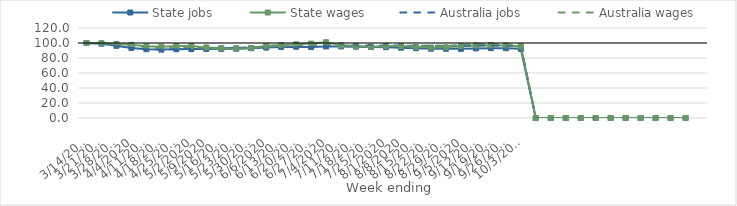
| Category | State jobs | State wages | Australia jobs | Australia wages |
|---|---|---|---|---|
| 14/03/2020 | 100 | 100 | 100 | 100 |
| 21/03/2020 | 99.066 | 99.679 | 99.271 | 99.673 |
| 28/03/2020 | 96.252 | 98.625 | 96.296 | 98.402 |
| 04/04/2020 | 93.293 | 97.505 | 93.638 | 96.698 |
| 11/04/2020 | 91.7 | 95.592 | 91.923 | 94.162 |
| 18/04/2020 | 91.206 | 95.086 | 91.471 | 94.06 |
| 25/04/2020 | 91.722 | 95.834 | 91.807 | 94.247 |
| 02/05/2020 | 91.848 | 96.045 | 92.206 | 94.699 |
| 09/05/2020 | 92.037 | 94.093 | 92.756 | 93.319 |
| 16/05/2020 | 92.231 | 93.337 | 93.289 | 92.663 |
| 23/05/2020 | 92.383 | 93.027 | 93.593 | 92.285 |
| 30/05/2020 | 93.03 | 93.352 | 94.094 | 93.58 |
| 06/06/2020 | 93.901 | 96.184 | 95.016 | 95.453 |
| 13/06/2020 | 94.772 | 97.191 | 95.471 | 96.086 |
| 20/06/2020 | 95.045 | 98.238 | 95.658 | 97.003 |
| 27/06/2020 | 94.642 | 99.197 | 95.603 | 97.208 |
| 04/07/2020 | 95.411 | 101.079 | 96.357 | 98.944 |
| 11/07/2020 | 95.451 | 96.839 | 96.686 | 95.884 |
| 18/07/2020 | 95.109 | 96.157 | 96.562 | 95.403 |
| 25/07/2020 | 94.642 | 95.045 | 96.622 | 95.053 |
| 01/08/2020 | 94.48 | 96.153 | 96.719 | 95.78 |
| 08/08/2020 | 93.744 | 95.928 | 96.574 | 96.121 |
| 15/08/2020 | 93.056 | 94.914 | 96.402 | 95.627 |
| 22/08/2020 | 92.4 | 93.896 | 96.279 | 95.418 |
| 29/08/2020 | 92.297 | 94.243 | 96.2 | 95.474 |
| 05/09/2020 | 92.263 | 96.007 | 96.273 | 97.682 |
| 12/09/2020 | 92.815 | 96.654 | 96.568 | 98.358 |
| 19/09/2020 | 93.101 | 97.146 | 96.733 | 98.934 |
| 26/09/2020 | 93.078 | 96.758 | 96.519 | 98.073 |
| 03/10/2020 | 92.26 | 95.761 | 95.865 | 96.714 |